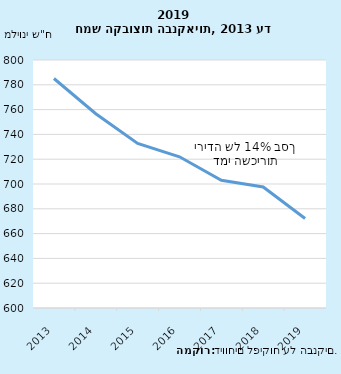
| Category | סך דמי שכירות, 2013 עד 2018, חמש הקבוצות הבנקאיות |
|---|---|
| 2013-12-31 | 785.071 |
| 2014-12-31 | 756.638 |
| 2015-12-31 | 732.664 |
| 2016-12-31 | 721.944 |
| 2017-12-31 | 703.007 |
| 2018-12-31 | 697.633 |
| 2019-12-31 | 672.184 |